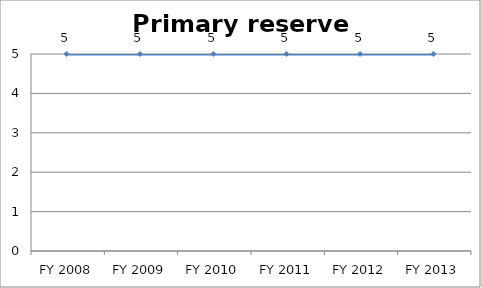
| Category | Primary reserve score |
|---|---|
| FY 2013 | 5 |
| FY 2012 | 5 |
| FY 2011 | 5 |
| FY 2010 | 5 |
| FY 2009 | 5 |
| FY 2008 | 5 |